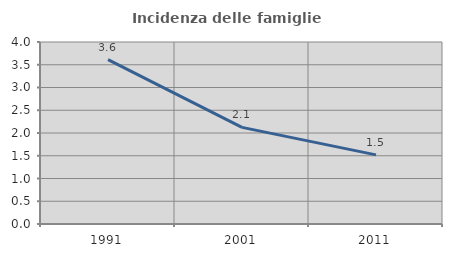
| Category | Incidenza delle famiglie numerose |
|---|---|
| 1991.0 | 3.614 |
| 2001.0 | 2.124 |
| 2011.0 | 1.519 |